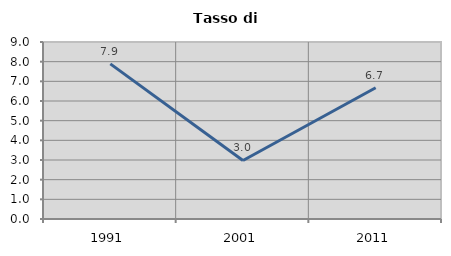
| Category | Tasso di disoccupazione   |
|---|---|
| 1991.0 | 7.889 |
| 2001.0 | 2.976 |
| 2011.0 | 6.671 |